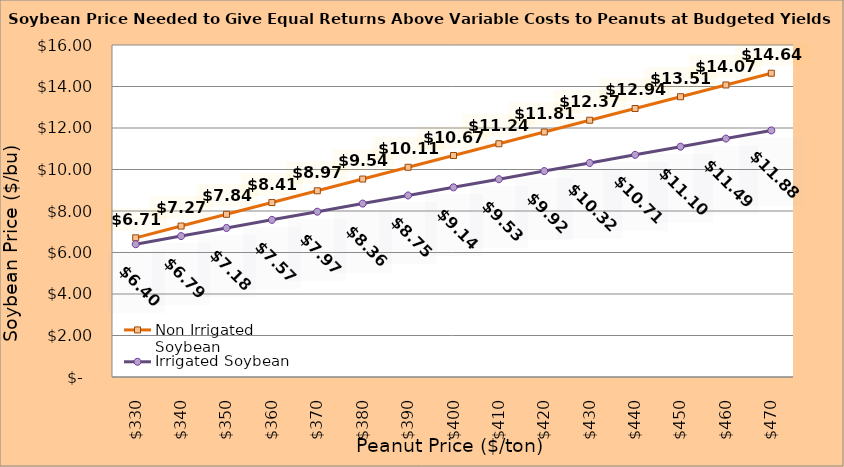
| Category | Non Irrigated Soybean | Irrigated Soybean |
|---|---|---|
| 330.0 | 6.707 | 6.399 |
| 340.0 | 7.274 | 6.791 |
| 350.0 | 7.84 | 7.182 |
| 360.0 | 8.407 | 7.574 |
| 370.0 | 8.974 | 7.966 |
| 380.0 | 9.54 | 8.357 |
| 390.0 | 10.107 | 8.749 |
| 400.0 | 10.674 | 9.141 |
| 410.0 | 11.24 | 9.532 |
| 420.0 | 11.807 | 9.924 |
| 430.0 | 12.374 | 10.316 |
| 440.0 | 12.94 | 10.707 |
| 450.0 | 13.507 | 11.099 |
| 460.0 | 14.074 | 11.491 |
| 470.0 | 14.64 | 11.882 |